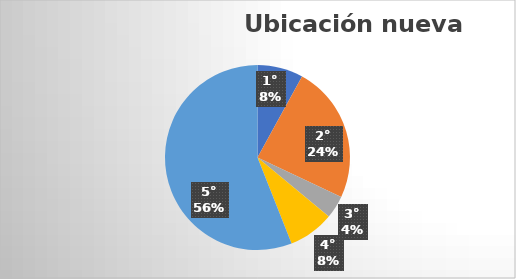
| Category | Series 0 |
|---|---|
| 1° | 2 |
| 2° | 6 |
| 3° | 1 |
| 4° | 2 |
| 5° | 14 |